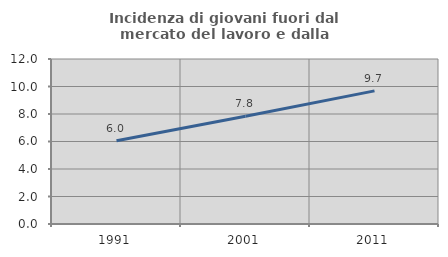
| Category | Incidenza di giovani fuori dal mercato del lavoro e dalla formazione  |
|---|---|
| 1991.0 | 6.048 |
| 2001.0 | 7.843 |
| 2011.0 | 9.683 |